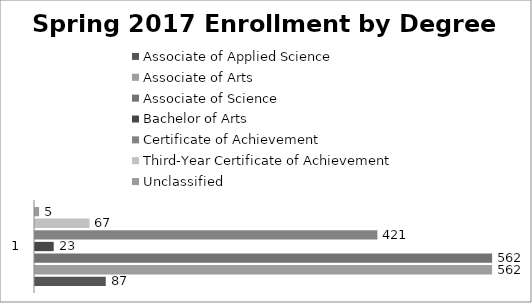
| Category | Associate of Applied Science | Associate of Arts | Associate of Science | Bachelor of Arts | Certificate of Achievement | Third-Year Certificate of Achievement | Unclassified |
|---|---|---|---|---|---|---|---|
| 0 | 87 | 562 | 562 | 23 | 421 | 67 | 5 |